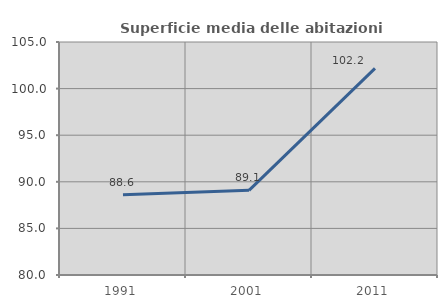
| Category | Superficie media delle abitazioni occupate |
|---|---|
| 1991.0 | 88.605 |
| 2001.0 | 89.084 |
| 2011.0 | 102.169 |